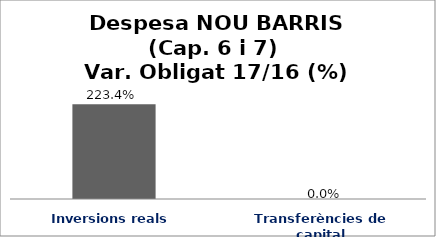
| Category | Series 0 |
|---|---|
| Inversions reals | 2.234 |
| Transferències de capital | 0 |